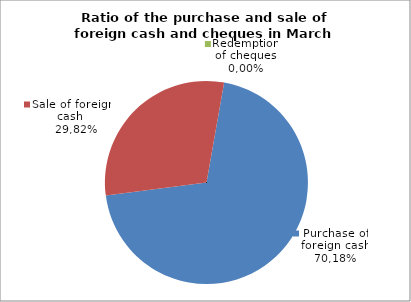
| Category | Purchase of foreign cash |
|---|---|
| 0 | 70.184 |
| 1 | 29.816 |
| 2 | 0 |